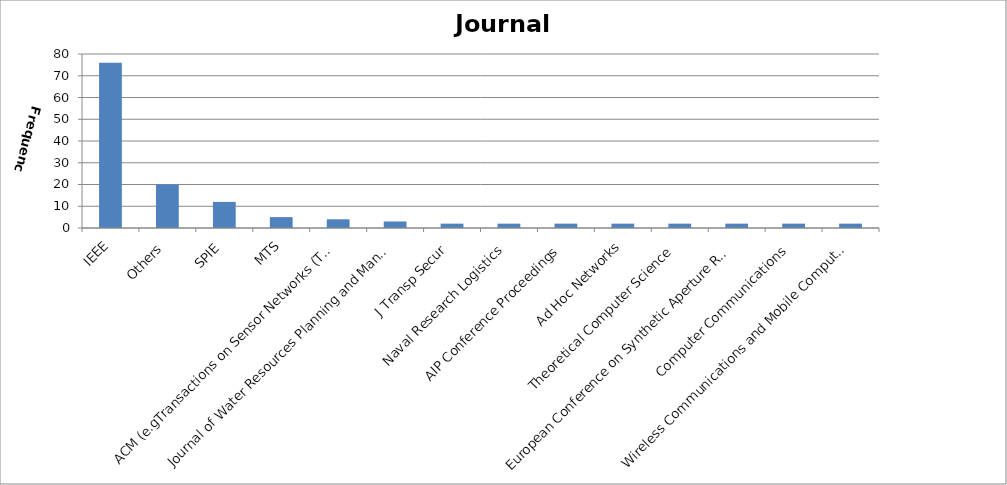
| Category | Journal Type |
|---|---|
| IEEE | 76 |
| Others | 20 |
| SPIE | 12 |
| MTS | 5 |
| ACM (e.gTransactions on Sensor Networks (TOSN) | 4 |
| Journal of Water Resources Planning and Management, | 3 |
| J Transp Secur | 2 |
| Naval Research Logistics | 2 |
| AIP Conference Proceedings | 2 |
| Ad Hoc Networks | 2 |
| Theoretical Computer Science | 2 |
| European Conference on Synthetic Aperture Radar;  | 2 |
| Computer Communications | 2 |
| Wireless Communications and Mobile Computing | 2 |